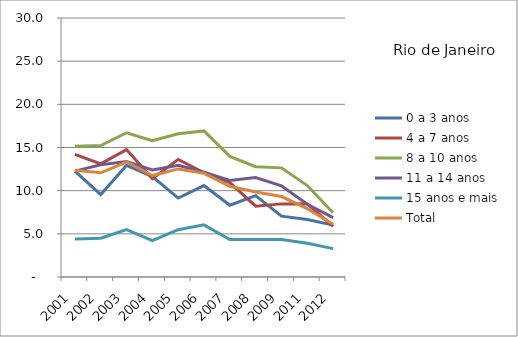
| Category | 0 a 3 anos | 4 a 7 anos | 8 a 10 anos | 11 a 14 anos | 15 anos e mais | Total |
|---|---|---|---|---|---|---|
| 2001.0 | 12.27 | 14.2 | 15.14 | 12.26 | 4.4 | 12.37 |
| 2002.0 | 9.55 | 13.11 | 15.23 | 13.01 | 4.49 | 12.07 |
| 2003.0 | 12.94 | 14.76 | 16.71 | 13.38 | 5.49 | 13.32 |
| 2004.0 | 11.63 | 11.39 | 15.8 | 12.4 | 4.2 | 11.75 |
| 2005.0 | 9.14 | 13.62 | 16.6 | 12.94 | 5.48 | 12.52 |
| 2006.0 | 10.59 | 12.08 | 16.92 | 12.13 | 6.04 | 12.01 |
| 2007.0 | 8.31 | 10.94 | 13.97 | 11.19 | 4.33 | 10.51 |
| 2008.0 | 9.43 | 8.21 | 12.78 | 11.51 | 4.33 | 9.85 |
| 2009.0 | 7.05 | 8.47 | 12.64 | 10.57 | 4.33 | 9.32 |
| 2011.0 | 6.67 | 8.48 | 10.59 | 8.42 | 3.92 | 7.92 |
| 2012.0 | 6.01 | 5.87 | 7.44 | 6.88 | 3.29 | 6.12 |